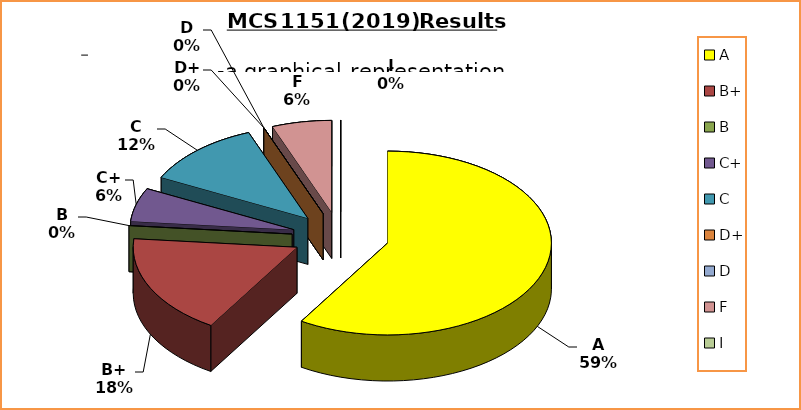
| Category | Series 0 |
|---|---|
| A | 10 |
| B+ | 3 |
| B | 0 |
| C+ | 1 |
| C | 2 |
| D+ | 0 |
| D | 0 |
| F | 1 |
| I | 0 |